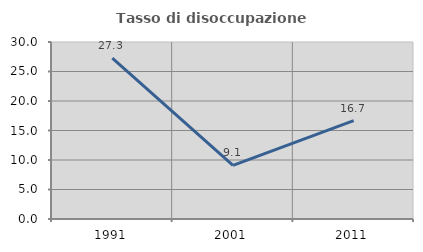
| Category | Tasso di disoccupazione giovanile  |
|---|---|
| 1991.0 | 27.273 |
| 2001.0 | 9.091 |
| 2011.0 | 16.667 |